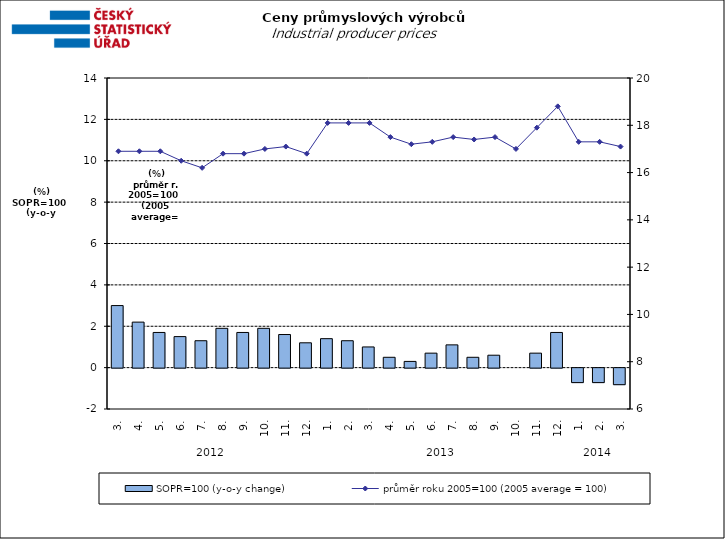
| Category | SOPR=100 (y-o-y change)   |
|---|---|
| 0 | 3 |
| 1 | 2.2 |
| 2 | 1.7 |
| 3 | 1.5 |
| 4 | 1.3 |
| 5 | 1.9 |
| 6 | 1.7 |
| 7 | 1.9 |
| 8 | 1.6 |
| 9 | 1.2 |
| 10 | 1.4 |
| 11 | 1.3 |
| 12 | 1 |
| 13 | 0.5 |
| 14 | 0.3 |
| 15 | 0.7 |
| 16 | 1.1 |
| 17 | 0.5 |
| 18 | 0.6 |
| 19 | 0 |
| 20 | 0.7 |
| 21 | 1.7 |
| 22 | -0.7 |
| 23 | -0.7 |
| 24 | -0.8 |